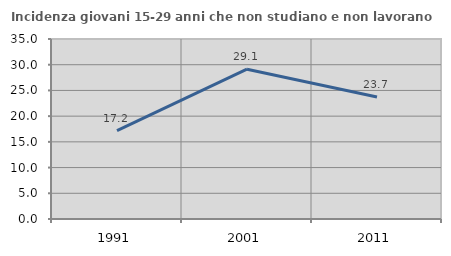
| Category | Incidenza giovani 15-29 anni che non studiano e non lavorano  |
|---|---|
| 1991.0 | 17.198 |
| 2001.0 | 29.132 |
| 2011.0 | 23.73 |